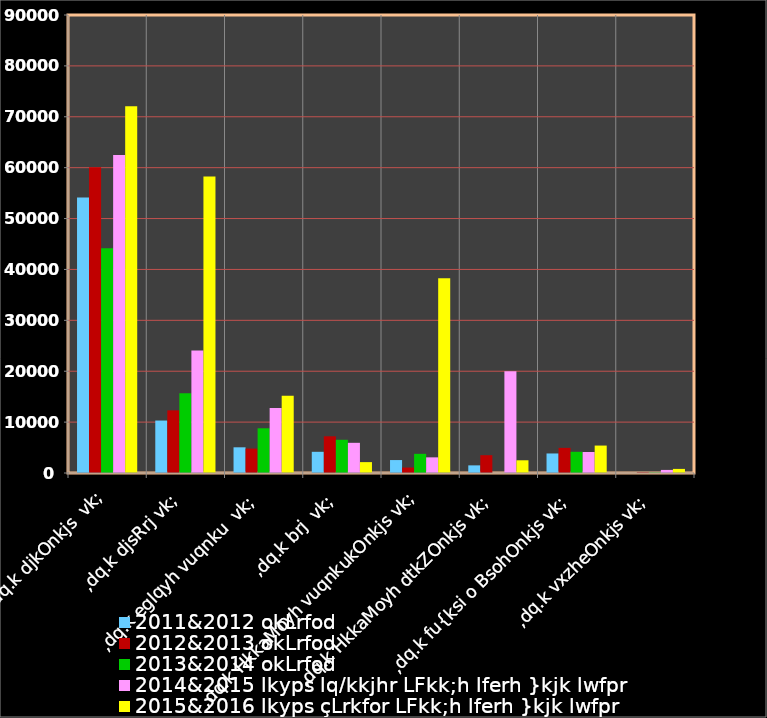
| Category | 2011&2012 okLrfod | 2012&2013 okLrfod | 2013&2014 okLrfod | 2014&2015 lkyps lq/kkjhr LFkk;h lferh }kjk lwfpr | 2015&2016 lkyps çLrkfor LFkk;h lferh }kjk lwfpr |
|---|---|---|---|---|---|
| ,dq.k djkOnkjs  vk; | 54143.49 | 60066.39 | 44169.99 | 62500 | 72085.05 |
| ,dq.k djsRrj vk; | 10308.75 | 12308.76 | 15653.04 | 24062.02 | 58254.02 |
| ,dq.k eglqyh vuqnku  vk; | 5049.59 | 4797.91 | 8784.52 | 12755 | 15167 |
| ,dq.k brj  vk; | 4163.69 | 7214.57 | 6527.1 | 5931 | 2139 |
| ,dq.k HkkaMoyh vuqnkukOnkjs vk; | 2543.78 | 1071.18 | 3766.03 | 3075 | 38275 |
| ,dq.k HkkaMoyh dtkZOnkjs vk; | 1500 | 3500 | 0 | 20000 | 2500 |
| ,dq.k fu{ksi o BsohOnkjs vk; | 3838.68 | 4939.51 | 4163.91 | 4125 | 5391.218 |
| ,dq.k vxzheOnkjs vk; | 1.23 | 114.46 | 82.17 | 605 | 805 |